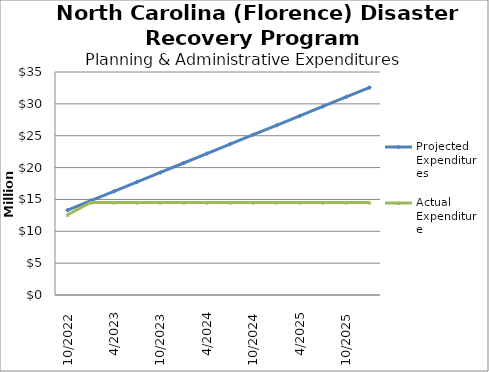
| Category | Projected Expenditures | Actual Expenditure |
|---|---|---|
| 10/2022 | 13319446 | 12595369.76 |
| 1/2023 | 14799384 | 14511875.06 |
| 4/2023 | 16279322 | 14511875.06 |
| 7/2023 | 17759260 | 14511875.06 |
| 10/2023 | 19239198 | 14511875.06 |
| 1/2024 | 20719136 | 14511875.06 |
| 4/2024 | 22199074 | 14511875.06 |
| 7/2024 | 23679012 | 14511875.06 |
| 10/2024 | 25158950 | 14511875.06 |
| 1/2025 | 26638888 | 14511875.06 |
| 4/2025 | 28118826 | 14511875.06 |
| 7/2025 | 29598764 | 14511875.06 |
| 10/2025 | 31078702 | 14511875.06 |
| 1/2026 | 32558640 | 14511875.06 |